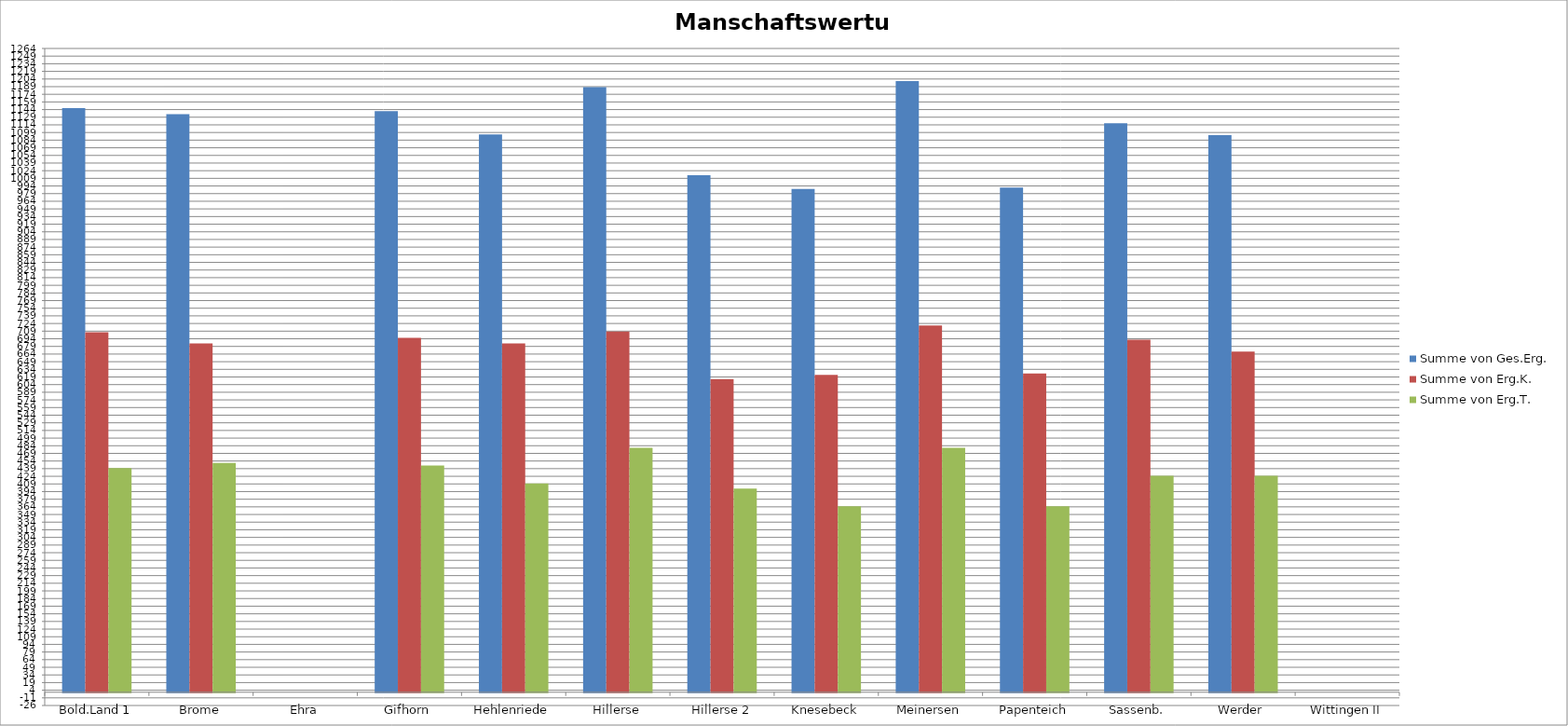
| Category | Summe von Ges.Erg. | Summe von Erg.K. | Summe von Erg.T. |
|---|---|---|---|
| Bold.Land 1 | 1147 | 707 | 440 |
| Brome | 1135 | 685 | 450 |
| Ehra | 0 | 0 | 0 |
| Gifhorn | 1141 | 696 | 445 |
| Hehlenriede | 1095 | 685 | 410 |
| Hillerse | 1188 | 708 | 480 |
| Hillerse 2 | 1015 | 615 | 400 |
| Knesebeck | 988 | 623 | 365 |
| Meinersen | 1200 | 720 | 480 |
| Papenteich | 991 | 626 | 365 |
| Sassenb. | 1117 | 692 | 425 |
| Werder | 1094 | 669 | 425 |
| Wittingen II | 0 | 0 | 0 |